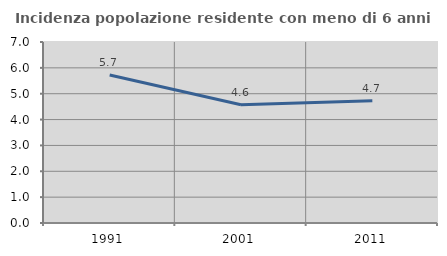
| Category | Incidenza popolazione residente con meno di 6 anni |
|---|---|
| 1991.0 | 5.723 |
| 2001.0 | 4.575 |
| 2011.0 | 4.73 |